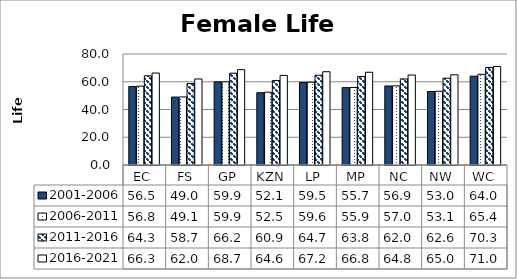
| Category | 2001-2006 | 2006-2011 | 2011-2016 | 2016-2021 |
|---|---|---|---|---|
| EC | 56.54 | 56.807 | 64.283 | 66.275 |
| FS | 48.953 | 49.062 | 58.708 | 62.002 |
| GP | 59.905 | 59.923 | 66.163 | 68.725 |
| KZN | 52.082 | 52.463 | 60.926 | 64.573 |
| LP | 59.479 | 59.647 | 64.703 | 67.238 |
| MP | 55.733 | 55.876 | 63.772 | 66.845 |
| NC | 56.946 | 57.019 | 62.033 | 64.849 |
| NW | 52.953 | 53.142 | 62.562 | 65.029 |
| WC | 64.028 | 65.36 | 70.315 | 70.987 |